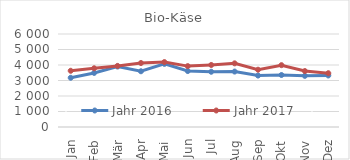
| Category | Jahr 2016 | Jahr 2017 |
|---|---|---|
| Jan | 3175.049 | 3627.216 |
| Feb | 3488.906 | 3788.551 |
| Mär | 3902.514 | 3940.935 |
| Apr | 3595.877 | 4126.871 |
| Mai | 4072.546 | 4187.531 |
| Jun | 3609.385 | 3928.155 |
| Jul | 3563.661 | 4002.012 |
| Aug | 3576.196 | 4106.582 |
| Sep | 3319.34 | 3696.737 |
| Okt | 3353.831 | 3989 |
| Nov | 3300.037 | 3608.817 |
| Dez | 3323.955 | 3470.68 |